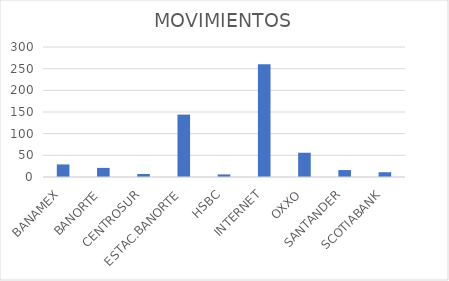
| Category | MOVIMIENTOS |
|---|---|
| BANAMEX | 29 |
| BANORTE | 21 |
| CENTROSUR | 7 |
| ESTAC.BANORTE | 144 |
| HSBC | 6 |
| INTERNET | 260 |
| OXXO | 56 |
| SANTANDER | 16 |
| SCOTIABANK | 11 |